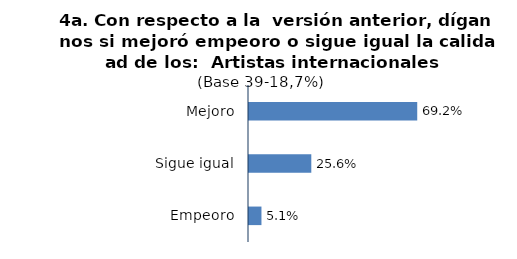
| Category | Series 0 |
|---|---|
| Mejoro | 0.692 |
| Sigue igual | 0.256 |
| Empeoro | 0.051 |